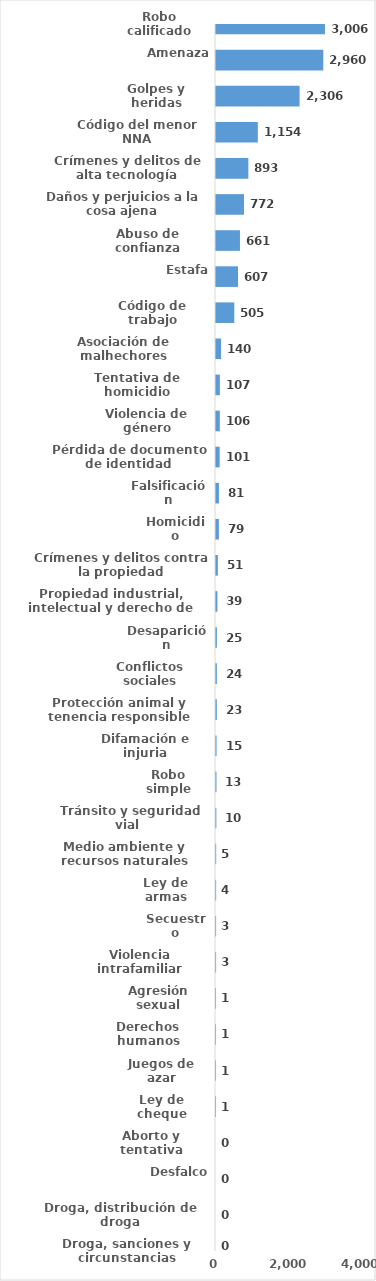
| Category | Series 0 |
|---|---|
| Robo calificado | 3006 |
| Amenaza | 2960 |
| Golpes y heridas | 2306 |
| Código del menor NNA | 1154 |
| Crímenes y delitos de alta tecnología | 893 |
| Daños y perjuicios a la cosa ajena | 772 |
| Abuso de confianza | 661 |
| Estafa | 607 |
| Código de trabajo | 505 |
| Asociación de malhechores | 140 |
| Tentativa de homicidio | 107 |
| Violencia de género | 106 |
| Pérdida de documento de identidad | 101 |
| Falsificación | 81 |
| Homicidio | 79 |
| Crímenes y delitos contra la propiedad | 51 |
| Propiedad industrial, intelectual y derecho de autor | 39 |
| Desaparición | 25 |
| Conflictos sociales | 24 |
| Protección animal y tenencia responsible | 23 |
| Difamación e injuria | 15 |
| Robo simple | 13 |
| Tránsito y seguridad vial  | 10 |
| Medio ambiente y recursos naturales | 5 |
| Ley de armas | 4 |
| Secuestro | 3 |
| Violencia intrafamiliar | 3 |
| Agresión sexual | 1 |
| Derechos humanos | 1 |
| Juegos de azar | 1 |
| Ley de cheque | 1 |
| Aborto y tentativa | 0 |
| Desfalco | 0 |
| Droga, distribución de droga | 0 |
| Droga, sanciones y circunstancias agravantes | 0 |